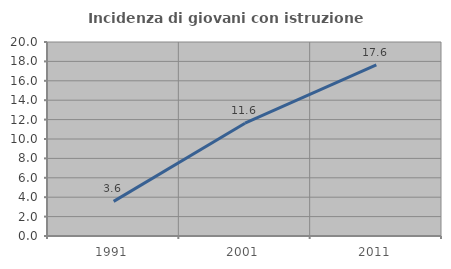
| Category | Incidenza di giovani con istruzione universitaria |
|---|---|
| 1991.0 | 3.571 |
| 2001.0 | 11.628 |
| 2011.0 | 17.647 |